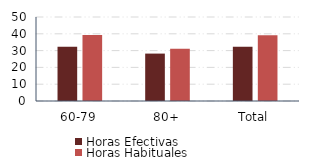
| Category | Horas Efectivas | Horas Habituales |
|---|---|---|
| 60-79 | 32.283 | 39.283 |
| 80+ | 28.22 | 31.152 |
| Total | 32.219 | 39.155 |